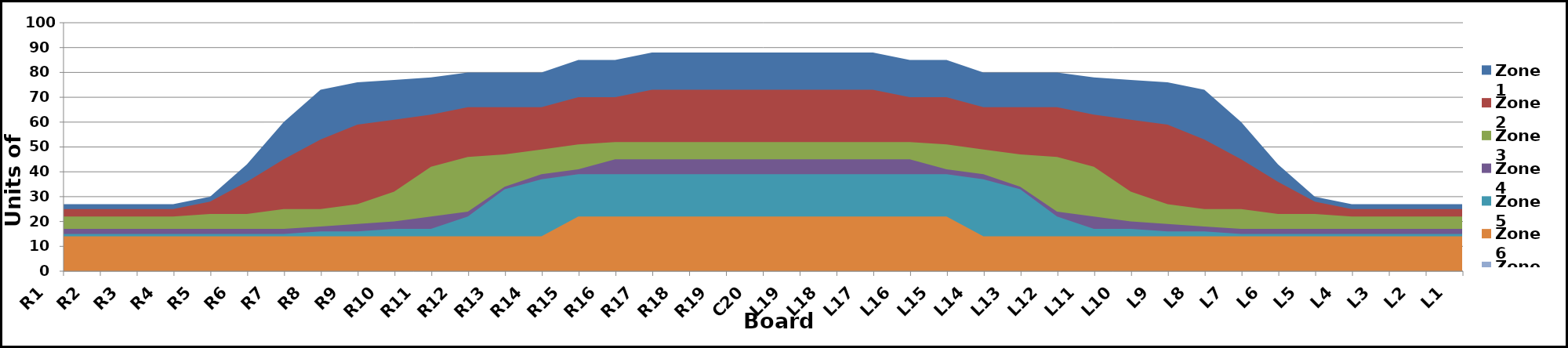
| Category | Zone 1 | Zone 2 | Zone 3 | Zone 4 | Zone 5 | Zone 6 | Zone 7 | Zone 8 |
|---|---|---|---|---|---|---|---|---|
| L1 | 27 | 25 | 22 | 17 | 15 | 14 | 0 |  |
| L2 | 27 | 25 | 22 | 17 | 15 | 14 | 0 |  |
| L3 | 27 | 25 | 22 | 17 | 15 | 14 | 0 |  |
| L4 | 27 | 25 | 22 | 17 | 15 | 14 | 0 |  |
| L5 | 30 | 28 | 23 | 17 | 15 | 14 | 0 |  |
| L6 | 43 | 36 | 23 | 17 | 15 | 14 | 0 |  |
| L7 | 60 | 45 | 25 | 17 | 15 | 14 | 0 |  |
| L8 | 73 | 53 | 25 | 18 | 16 | 14 | 0 |  |
| L9 | 76 | 59 | 27 | 19 | 16 | 14 | 0 |  |
| L10 | 77 | 61 | 32 | 20 | 17 | 14 | 0 |  |
| L11 | 78 | 63 | 42 | 22 | 17 | 14 | 0 |  |
| L12 | 80 | 66 | 46 | 24 | 22 | 14 | 0 |  |
| L13 | 80 | 66 | 47 | 34 | 33 | 14 | 0 |  |
| L14 | 80 | 66 | 49 | 39 | 37 | 14 | 0 |  |
| L15 | 85 | 70 | 51 | 41 | 39 | 22 | 0 |  |
| L16 | 85 | 70 | 52 | 45 | 39 | 22 | 0 |  |
| L17 | 88 | 73 | 52 | 45 | 39 | 22 | 0 |  |
| L18 | 88 | 73 | 52 | 45 | 39 | 22 | 0 |  |
| L19 | 88 | 73 | 52 | 45 | 39 | 22 | 0 |  |
| C20 | 88 | 73 | 52 | 45 | 39 | 22 | 0 |  |
| R19 | 88 | 73 | 52 | 45 | 39 | 22 | 0 |  |
| R18 | 88 | 73 | 52 | 45 | 39 | 22 | 0 |  |
| R17 | 88 | 73 | 52 | 45 | 39 | 22 | 0 |  |
| R16 | 85 | 70 | 52 | 45 | 39 | 22 | 0 |  |
| R15 | 85 | 70 | 51 | 41 | 39 | 22 | 0 |  |
| R14 | 80 | 66 | 49 | 39 | 37 | 14 | 0 |  |
| R13 | 80 | 66 | 47 | 34 | 33 | 14 | 0 |  |
| R12 | 80 | 66 | 46 | 24 | 22 | 14 | 0 |  |
| R11 | 78 | 63 | 42 | 22 | 17 | 14 | 0 |  |
| R10 | 77 | 61 | 32 | 20 | 17 | 14 | 0 |  |
| R9 | 76 | 59 | 27 | 19 | 16 | 14 | 0 |  |
| R8 | 73 | 53 | 25 | 18 | 16 | 14 | 0 |  |
| R7 | 60 | 45 | 25 | 17 | 15 | 14 | 0 |  |
| R6 | 43 | 36 | 23 | 17 | 15 | 14 | 0 |  |
| R5 | 30 | 28 | 23 | 17 | 15 | 14 | 0 |  |
| R4 | 27 | 25 | 22 | 17 | 15 | 14 | 0 |  |
| R3 | 27 | 25 | 22 | 17 | 15 | 14 | 0 |  |
| R2 | 27 | 25 | 22 | 17 | 15 | 14 | 0 |  |
| R1 | 27 | 25 | 22 | 17 | 15 | 14 | 0 |  |